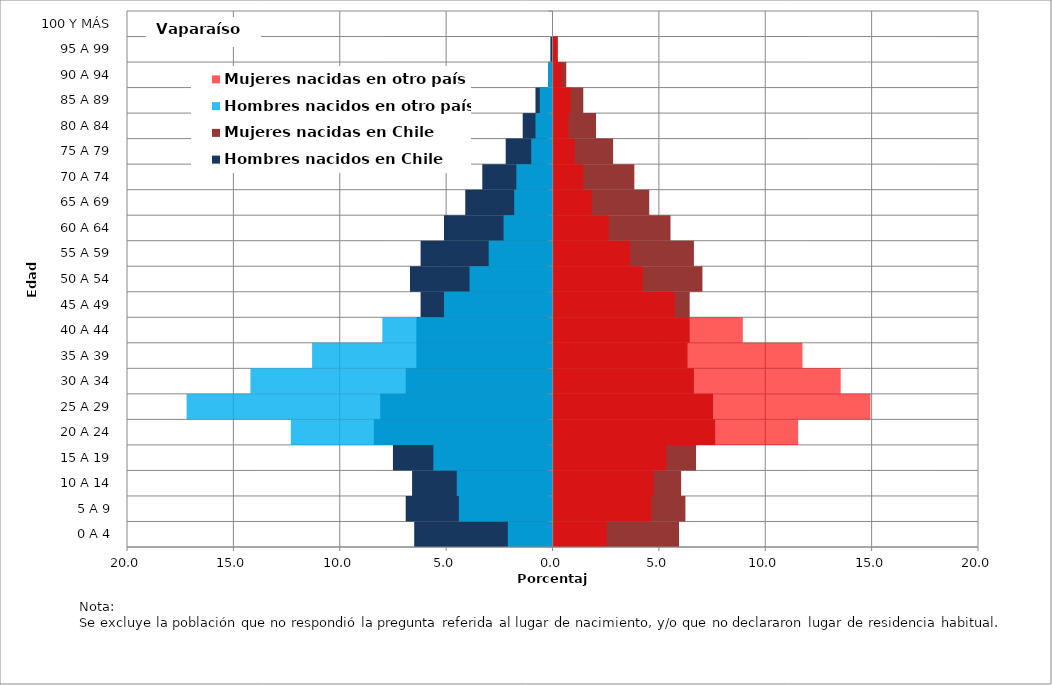
| Category | Hombres nacidos en Chile | Mujeres nacidas en Chile | Hombres nacidos en otro país | Mujeres nacidas en otro país |
|---|---|---|---|---|
| 0 A 4 | -6.5 | 5.9 | -2.1 | 2.5 |
| 5 A 9 | -6.9 | 6.2 | -4.4 | 4.6 |
| 10 A 14 | -6.6 | 6 | -4.5 | 4.7 |
| 15 A 19 | -7.5 | 6.7 | -5.6 | 5.3 |
| 20 A 24 | -8.4 | 7.6 | -12.3 | 11.5 |
| 25 A 29 | -8.1 | 7.5 | -17.2 | 14.9 |
| 30 A 34 | -6.9 | 6.6 | -14.2 | 13.5 |
| 35 A 39 | -6.4 | 6.3 | -11.3 | 11.7 |
| 40 A 44 | -6.4 | 6.4 | -8 | 8.9 |
| 45 A 49 | -6.2 | 6.4 | -5.1 | 5.7 |
| 50 A 54 | -6.7 | 7 | -3.9 | 4.2 |
| 55 A 59 | -6.2 | 6.6 | -3 | 3.6 |
| 60 A 64 | -5.1 | 5.5 | -2.3 | 2.6 |
| 65 A 69 | -4.1 | 4.5 | -1.8 | 1.8 |
| 70 A 74 | -3.3 | 3.8 | -1.7 | 1.4 |
| 75 A 79 | -2.2 | 2.8 | -1 | 1 |
| 80 A 84 | -1.4 | 2 | -0.8 | 0.7 |
| 85 A 89 | -0.8 | 1.4 | -0.6 | 0.8 |
| 90 A 94 | -0.2 | 0.6 | -0.2 | 0.4 |
| 95 A 99 | -0.1 | 0.2 | 0 | 0.2 |
| 100 Y MÁS | 0 | 0 | 0 | 0 |